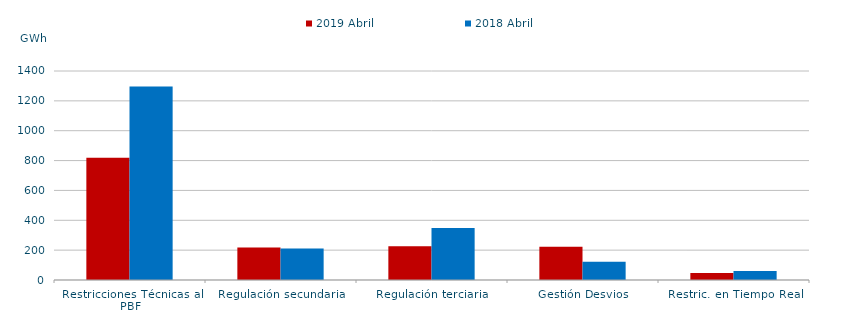
| Category | 2019 Abril | 2018 Abril |
|---|---|---|
| Restricciones Técnicas al PBF | 818.212 | 1296.816 |
| Regulación secundaria | 218.321 | 210.676 |
| Regulación terciaria | 226.326 | 347.866 |
| Gestión Desvios | 222.86 | 122.622 |
| Restric. en Tiempo Real | 47.017 | 60.774 |